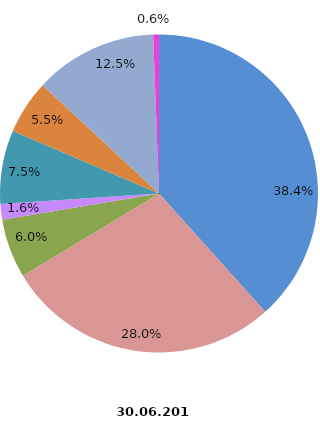
| Category | Anzahl Beschäftigte 2017 |
|---|---|
| Elektroinstallation | 5644 |
| Gas-, Wasser-, Heizungs- sowie Lüftungs- und Klimainstallation | 4121 |
| Sonstige Bauinstallation | 882 |
| Anbringen von Stuckaturen, Gipserei und Verputzerei | 237 |
| Bautischlerei und -schlosserei | 1099 |
| Fußboden-, Fliesen- und Plattenlegerei, Tapeziererei | 810 |
| Malerei und Glaserei | 1837 |
| Sonstiger Ausbau a. n. g. | 86 |